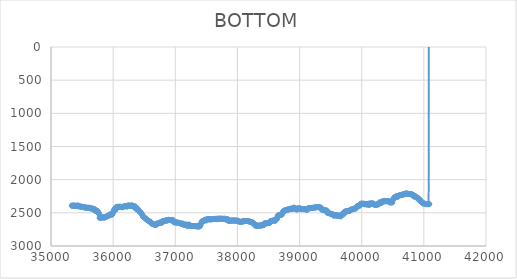
| Category | BOTTOM |
|---|---|
| 35334.9309 | 2391.88 |
| 35342.0646 | 2391.86 |
| 35352.3041 | 2391.86 |
| 35362.5442 | 2391.86 |
| 35372.7842 | 2391.86 |
| 35383.0243 | 2393.23 |
| 35393.2643 | 2393.26 |
| 35403.5044 | 2393.26 |
| 35413.7444 | 2393.26 |
| 35423.9845 | 2398.76 |
| 35434.2245 | 2387.91 |
| 35444.4646 | 2401.37 |
| 35454.7046 | 2403.08 |
| 35464.9447 | 2404.49 |
| 35475.1847 | 2405.9 |
| 35485.4248 | 2407.31 |
| 35495.6648 | 2408.72 |
| 35505.9049 | 2411.5 |
| 35516.1449 | 2414.31 |
| 35526.385 | 2414.38 |
| 35536.625 | 2415.75 |
| 35546.8651 | 2418.54 |
| 35557.1051 | 2421.35 |
| 35567.3452 | 2422.79 |
| 35577.5852 | 2424.2 |
| 35587.8253 | 2422.85 |
| 35598.0653 | 2424.2 |
| 35608.3054 | 2424.23 |
| 35618.5454 | 2425.61 |
| 35628.7855 | 2429.78 |
| 35639.0255 | 2435.38 |
| 35649.2656 | 2432.73 |
| 35659.5056 | 2432.68 |
| 35669.7457 | 2436.82 |
| 35679.9857 | 2445.18 |
| 35690.2258 | 2449.49 |
| 35700.4658 | 2442.66 |
| 35710.7059 | 2470.15 |
| 35720.9459 | 2461.01 |
| 35731.186 | 2469.12 |
| 35741.426 | 2467.89 |
| 35751.6661 | 2481.69 |
| 35761.9061 | 2504.06 |
| 35772.1462 | 2504.47 |
| 35782.3862 | 2573.62 |
| 35792.6263 | 2576.23 |
| 35802.8663 | 2569.34 |
| 35813.1064 | 2569.22 |
| 35823.3464 | 2569.22 |
| 35833.5865 | 2569.22 |
| 35843.8265 | 2569.22 |
| 35854.0666 | 2569.22 |
| 35864.3066 | 2569.22 |
| 35874.5467 | 2564.5 |
| 35884.7867 | 2559.72 |
| 35895.0268 | 2554.93 |
| 35905.2668 | 2550.14 |
| 35915.5069 | 2545.36 |
| 35925.7469 | 2545.29 |
| 35935.987 | 2530.03 |
| 35946.227 | 2525.64 |
| 35956.4671 | 2526.97 |
| 35966.7071 | 2526.99 |
| 35976.9472 | 2528.38 |
| 35987.1872 | 2520.06 |
| 35997.4273 | 2497.72 |
| 36007.6673 | 2472.42 |
| 36017.9074 | 2452.64 |
| 36028.1474 | 2437.09 |
| 36038.3875 | 2454.97 |
| 36048.6275 | 2414.87 |
| 36058.8676 | 2411.6 |
| 36069.1076 | 2408.78 |
| 36079.3477 | 2410.14 |
| 36089.5877 | 2408.76 |
| 36099.8278 | 2410.14 |
| 36110.0678 | 2408.76 |
| 36120.3079 | 2408.75 |
| 36130.5479 | 2410.14 |
| 36140.788 | 2415.73 |
| 36151.028 | 2414.39 |
| 36161.2681 | 2411.59 |
| 36171.5081 | 2403.2 |
| 36181.7482 | 2398.93 |
| 36191.9882 | 2397.5 |
| 36202.2283 | 2398.88 |
| 36212.4683 | 2396.1 |
| 36222.7084 | 2407.24 |
| 36232.9484 | 2391.99 |
| 36243.1885 | 2393.25 |
| 36253.4285 | 2387.68 |
| 36263.6686 | 2393.22 |
| 36273.9086 | 2394.66 |
| 36284.1487 | 2394.67 |
| 36294.3887 | 2389.08 |
| 36304.6288 | 2389.04 |
| 36314.8688 | 2393.24 |
| 36325.1089 | 2405.85 |
| 36335.3489 | 2405.93 |
| 36345.589 | 2401.74 |
| 36355.829 | 2405.91 |
| 36366.0691 | 2438.12 |
| 36376.3091 | 2439.71 |
| 36386.5492 | 2432.72 |
| 36396.7892 | 2448.08 |
| 36407.0293 | 2463.57 |
| 36417.2693 | 2472.75 |
| 36427.5094 | 2481.9 |
| 36437.7494 | 2491.05 |
| 36447.9895 | 2500.2 |
| 36458.2295 | 2514.96 |
| 36468.4696 | 2529.75 |
| 36478.7096 | 2553.65 |
| 36488.9497 | 2561.21 |
| 36499.1897 | 2568.72 |
| 36509.4298 | 2576.23 |
| 36519.6698 | 2584.33 |
| 36529.9099 | 2592.42 |
| 36540.1499 | 2600.52 |
| 36550.39 | 2608.61 |
| 36560.63 | 2614.81 |
| 36570.8701 | 2621.01 |
| 36581.1101 | 2627.2 |
| 36591.3502 | 2633.4 |
| 36601.5902 | 2639.59 |
| 36611.8303 | 2651.55 |
| 36622.0703 | 2663.52 |
| 36632.3104 | 2667.04 |
| 36642.5504 | 2670.56 |
| 36652.7905 | 2674.08 |
| 36663.0305 | 2677.6 |
| 36673.2706 | 2680.42 |
| 36683.5106 | 2676.2 |
| 36693.7507 | 2679 |
| 36703.9907 | 2664.93 |
| 36714.2308 | 2657.9 |
| 36724.4708 | 2660.7 |
| 36734.7109 | 2655.08 |
| 36744.9509 | 2653.66 |
| 36755.191 | 2646.63 |
| 36765.431 | 2642.42 |
| 36775.6711 | 2648.04 |
| 36785.9111 | 2647.98 |
| 36796.1512 | 2622.72 |
| 36806.3912 | 2629.72 |
| 36816.6313 | 2622.7 |
| 36826.8713 | 2621.29 |
| 36837.1114 | 2619.87 |
| 36847.3514 | 2612.86 |
| 36857.5915 | 2615.66 |
| 36867.8315 | 2614.25 |
| 36878.0716 | 2612.82 |
| 36888.3116 | 2605.81 |
| 36898.5517 | 2604.43 |
| 36908.7917 | 2608.63 |
| 36919.0318 | 2608.65 |
| 36929.2718 | 2612.84 |
| 36939.5119 | 2611.45 |
| 36949.7519 | 2612.81 |
| 36959.992 | 2605.92 |
| 36970.232 | 2622.83 |
| 36980.4721 | 2642.41 |
| 36990.7121 | 2642.41 |
| 37000.9522 | 2642.43 |
| 37011.1922 | 2645.23 |
| 37021.4323 | 2645.24 |
| 37031.6723 | 2646.66 |
| 37041.9124 | 2649.46 |
| 37052.1524 | 2650.87 |
| 37062.3925 | 2652.28 |
| 37072.6325 | 2653.68 |
| 37082.8726 | 2655.19 |
| 37093.1126 | 2667.76 |
| 37103.3527 | 2669.09 |
| 37113.5927 | 2662.13 |
| 37123.8328 | 2663.68 |
| 37134.0728 | 2680.42 |
| 37144.3129 | 2680.42 |
| 37154.5529 | 2680.4 |
| 37164.793 | 2679 |
| 37175.033 | 2677.6 |
| 37185.2731 | 2677.85 |
| 37195.5131 | 2701.41 |
| 37205.7532 | 2690.13 |
| 37215.9932 | 2677.65 |
| 37226.2333 | 2681.94 |
| 37236.4733 | 2691.73 |
| 37246.7134 | 2695.92 |
| 37256.9534 | 2697.31 |
| 37267.1935 | 2697.33 |
| 37277.4335 | 2698.73 |
| 37287.6736 | 2700.12 |
| 37297.9136 | 2700.12 |
| 37308.1537 | 2700.11 |
| 37318.3937 | 2698.75 |
| 37328.6338 | 2701.48 |
| 37338.8739 | 2697.42 |
| 37349.1139 | 2705.74 |
| 37359.354 | 2704.35 |
| 37369.594 | 2704.37 |
| 37379.8341 | 2705.75 |
| 37390.0741 | 2705.61 |
| 37400.3142 | 2695.53 |
| 37410.5542 | 2670.21 |
| 37420.7943 | 2646.34 |
| 37431.0343 | 2626.91 |
| 37441.2744 | 2625.45 |
| 37451.5144 | 2621.34 |
| 37461.7545 | 2623.82 |
| 37471.9945 | 2605.79 |
| 37482.2346 | 2604.36 |
| 37492.4746 | 2601.8 |
| 37502.7147 | 2613.98 |
| 37512.9547 | 2597.34 |
| 37523.1948 | 2595.94 |
| 37533.4348 | 2594.53 |
| 37543.6749 | 2593.25 |
| 37553.9149 | 2598.8 |
| 37564.155 | 2600.16 |
| 37574.395 | 2598.72 |
| 37584.6351 | 2595.93 |
| 37594.8751 | 2594.55 |
| 37605.1152 | 2594.55 |
| 37615.3552 | 2594.5 |
| 37625.5953 | 2591.74 |
| 37635.8353 | 2591.74 |
| 37646.0754 | 2591.71 |
| 37656.3154 | 2590.33 |
| 37666.5555 | 2590.47 |
| 37676.7955 | 2597.2 |
| 37687.0356 | 2588.92 |
| 37697.2756 | 2588.92 |
| 37707.5157 | 2588.92 |
| 37717.7557 | 2588.92 |
| 37727.9958 | 2588.92 |
| 37738.2358 | 2588.95 |
| 37748.4759 | 2590.33 |
| 37758.7159 | 2590.36 |
| 37768.956 | 2591.64 |
| 37779.196 | 2587.64 |
| 37789.4361 | 2593.05 |
| 37799.6761 | 2588.99 |
| 37809.9162 | 2592.09 |
| 37820.1562 | 2606.9 |
| 37830.3963 | 2593.31 |
| 37840.6363 | 2600.18 |
| 37850.8764 | 2600.72 |
| 37861.1164 | 2622.64 |
| 37871.3565 | 2619.86 |
| 37881.5965 | 2618.48 |
| 37891.8366 | 2618.45 |
| 37902.0766 | 2617.08 |
| 37912.3167 | 2617.04 |
| 37922.5567 | 2615.67 |
| 37932.7968 | 2615.67 |
| 37943.0368 | 2615.7 |
| 37953.2769 | 2617.08 |
| 37963.5169 | 2617.11 |
| 37973.757 | 2618.52 |
| 37983.997 | 2619.78 |
| 37994.2371 | 2615.79 |
| 38004.4771 | 2620.29 |
| 38014.7172 | 2624.8 |
| 38024.9572 | 2629.3 |
| 38035.1973 | 2633.81 |
| 38045.4373 | 2638.13 |
| 38055.6774 | 2635.87 |
| 38065.9174 | 2633.62 |
| 38076.1575 | 2631.37 |
| 38086.3975 | 2629.12 |
| 38096.6376 | 2626.9 |
| 38106.8776 | 2625.96 |
| 38117.1177 | 2625.02 |
| 38127.3577 | 2624.11 |
| 38137.5978 | 2624.11 |
| 38147.8378 | 2624.11 |
| 38158.0779 | 2624.11 |
| 38168.3179 | 2624.2 |
| 38178.558 | 2627.01 |
| 38188.798 | 2629.83 |
| 38199.0381 | 2632.65 |
| 38209.2781 | 2635.46 |
| 38219.5182 | 2638.31 |
| 38229.7582 | 2642.07 |
| 38239.9983 | 2644 |
| 38250.2383 | 2649.94 |
| 38260.4784 | 2665.02 |
| 38270.7184 | 2667.84 |
| 38280.9585 | 2671.38 |
| 38291.1985 | 2695.67 |
| 38301.4386 | 2689.05 |
| 38311.6786 | 2694.63 |
| 38321.9187 | 2698.48 |
| 38332.1587 | 2691.77 |
| 38342.3988 | 2694.4 |
| 38352.6388 | 2691.68 |
| 38362.8789 | 2691.77 |
| 38373.1189 | 2694.25 |
| 38383.359 | 2687.5 |
| 38393.599 | 2688.67 |
| 38403.8391 | 2683.38 |
| 38414.0791 | 2687.31 |
| 38424.3192 | 2682.39 |
| 38434.5592 | 2659.3 |
| 38444.7993 | 2659.25 |
| 38455.0393 | 2657.85 |
| 38465.2794 | 2656.49 |
| 38475.5194 | 2656.44 |
| 38485.7595 | 2655.08 |
| 38495.9995 | 2655.08 |
| 38506.2396 | 2655.03 |
| 38516.4796 | 2652.79 |
| 38526.7197 | 2629.48 |
| 38536.9597 | 2622.86 |
| 38547.1998 | 2626.66 |
| 38557.4398 | 2619.84 |
| 38567.6799 | 2618.43 |
| 38577.9199 | 2617.08 |
| 38588.16 | 2616.97 |
| 38598.4 | 2614.48 |
| 38608.6401 | 2618.85 |
| 38618.8801 | 2593.15 |
| 38629.1202 | 2593.03 |
| 38639.3602 | 2588.5 |
| 38649.6003 | 2543.71 |
| 38659.8403 | 2539.38 |
| 38670.0804 | 2532.73 |
| 38680.3204 | 2535.32 |
| 38690.5605 | 2532.5 |
| 38700.8005 | 2529.75 |
| 38711.0406 | 2527.88 |
| 38721.2806 | 2514.57 |
| 38731.5207 | 2486.93 |
| 38741.7607 | 2472.09 |
| 38752.0008 | 2471.74 |
| 38762.2408 | 2463.53 |
| 38772.4809 | 2460.83 |
| 38782.7209 | 2460.71 |
| 38792.961 | 2458.01 |
| 38803.201 | 2457.47 |
| 38813.4411 | 2445.53 |
| 38823.6811 | 2449.26 |
| 38833.9212 | 2442.59 |
| 38844.1612 | 2443.75 |
| 38854.4013 | 2439.65 |
| 38864.6413 | 2438.12 |
| 38874.8814 | 2434.33 |
| 38885.1214 | 2439.72 |
| 38895.3615 | 2439.02 |
| 38905.6015 | 2424.11 |
| 38915.8416 | 2422.05 |
| 38926.0816 | 2435.62 |
| 38936.3217 | 2438.31 |
| 38946.5617 | 2439.01 |
| 38956.8018 | 2452.89 |
| 38967.0418 | 2434.08 |
| 38977.2819 | 2434.08 |
| 38987.5219 | 2434.08 |
| 38997.762 | 2434.08 |
| 39008.002 | 2434.15 |
| 39018.2421 | 2435.96 |
| 39028.4821 | 2445.28 |
| 39038.7222 | 2443.94 |
| 39048.9622 | 2443.94 |
| 39059.2023 | 2443.94 |
| 39069.4423 | 2443.94 |
| 39079.6824 | 2443.94 |
| 39089.9224 | 2444.28 |
| 39100.1625 | 2450.84 |
| 39110.4025 | 2448.51 |
| 39120.6426 | 2454.85 |
| 39130.8827 | 2447.33 |
| 39141.1227 | 2431.13 |
| 39151.3628 | 2428.45 |
| 39161.6028 | 2428.45 |
| 39171.8429 | 2428.38 |
| 39182.0829 | 2427.12 |
| 39192.323 | 2428.38 |
| 39202.563 | 2426.83 |
| 39212.8031 | 2422.97 |
| 39223.0431 | 2425.42 |
| 39233.2832 | 2421.34 |
| 39243.5232 | 2420.01 |
| 39253.7633 | 2419.72 |
| 39264.0033 | 2414.38 |
| 39274.2434 | 2414.38 |
| 39284.4834 | 2414.45 |
| 39294.7235 | 2415.56 |
| 39304.9635 | 2411.71 |
| 39315.2036 | 2414.38 |
| 39325.4436 | 2414.75 |
| 39335.6837 | 2421.57 |
| 39345.9237 | 2425.74 |
| 39356.1638 | 2452.38 |
| 39366.4038 | 2452.46 |
| 39376.6439 | 2453.87 |
| 39386.8839 | 2455.2 |
| 39397.124 | 2455.66 |
| 39407.364 | 2463.72 |
| 39417.6041 | 2464.98 |
| 39427.8441 | 2463.72 |
| 39438.0842 | 2467 |
| 39448.3242 | 2500.24 |
| 39458.5643 | 2500.32 |
| 39468.8043 | 2501.97 |
| 39479.0444 | 2507.28 |
| 39489.2844 | 2507.84 |
| 39499.5245 | 2517.29 |
| 39509.7645 | 2520.03 |
| 39520.0046 | 2521.36 |
| 39530.2446 | 2521.52 |
| 39540.4847 | 2525.22 |
| 39550.7247 | 2542.39 |
| 39560.9648 | 2540.57 |
| 39571.2048 | 2533.03 |
| 39581.4449 | 2539.66 |
| 39591.6849 | 2539.49 |
| 39601.925 | 2537.09 |
| 39612.165 | 2541.06 |
| 39622.4051 | 2541.4 |
| 39632.6451 | 2546.69 |
| 39642.8852 | 2546.95 |
| 39653.1252 | 2551.17 |
| 39663.3653 | 2553.45 |
| 39673.6053 | 2526.73 |
| 39683.8454 | 2522.76 |
| 39694.0854 | 2522.94 |
| 39704.3255 | 2524.38 |
| 39714.5655 | 2504.5 |
| 39724.8056 | 2483.35 |
| 39735.0456 | 2483.01 |
| 39745.2857 | 2477.72 |
| 39755.5257 | 2477.63 |
| 39765.7658 | 2476.23 |
| 39776.0058 | 2474.64 |
| 39786.2459 | 2470.68 |
| 39796.4859 | 2470.68 |
| 39806.726 | 2469.71 |
| 39816.966 | 2455.11 |
| 39827.2061 | 2453.44 |
| 39837.4461 | 2448.07 |
| 39847.6862 | 2446.57 |
| 39857.9262 | 2443.85 |
| 39868.1663 | 2442.17 |
| 39878.4063 | 2436.99 |
| 39888.6464 | 2438.31 |
| 39898.8864 | 2437.03 |
| 39909.1265 | 2418.6 |
| 39919.3665 | 2417.14 |
| 39929.6066 | 2396.08 |
| 39939.8466 | 2395.99 |
| 39950.0867 | 2394.49 |
| 39960.3267 | 2391.86 |
| 39970.5668 | 2390.28 |
| 39980.8068 | 2367.46 |
| 39991.0469 | 2360.98 |
| 40001.2869 | 2362.39 |
| 40011.527 | 2363.61 |
| 40021.767 | 2362.3 |
| 40032.0071 | 2362.86 |
| 40042.2471 | 2370.55 |
| 40052.4872 | 2367.93 |
| 40062.7272 | 2368.21 |
| 40072.9673 | 2372.15 |
| 40083.2073 | 2372.15 |
| 40093.4474 | 2372.44 |
| 40103.6874 | 2375.21 |
| 40113.9275 | 2361.13 |
| 40124.1675 | 2381.85 |
| 40134.4076 | 2360.79 |
| 40144.6476 | 2359.48 |
| 40154.8877 | 2359.38 |
| 40165.1277 | 2358.07 |
| 40175.3678 | 2358.27 |
| 40185.6078 | 2361.38 |
| 40195.8479 | 2368.72 |
| 40206.0879 | 2379.19 |
| 40216.328 | 2379.09 |
| 40226.568 | 2378.18 |
| 40236.8081 | 2382.81 |
| 40247.0481 | 2374.26 |
| 40257.2882 | 2365.72 |
| 40267.5282 | 2372.95 |
| 40277.7683 | 2363.39 |
| 40288.0083 | 2341.39 |
| 40298.2484 | 2344.51 |
| 40308.4884 | 2350.93 |
| 40318.7285 | 2348.09 |
| 40328.9685 | 2328.51 |
| 40339.2086 | 2328.51 |
| 40349.4486 | 2328.41 |
| 40359.6887 | 2326.48 |
| 40369.9288 | 2319.18 |
| 40380.1688 | 2325.59 |
| 40390.4089 | 2324.29 |
| 40400.6489 | 2324.29 |
| 40410.889 | 2324.4 |
| 40421.129 | 2325.7 |
| 40431.3691 | 2325.8 |
| 40441.6091 | 2328.17 |
| 40451.8492 | 2341.29 |
| 40462.0892 | 2342.59 |
| 40472.3293 | 2342.7 |
| 40482.5693 | 2344 |
| 40492.8094 | 2340.77 |
| 40503.0494 | 2300.69 |
| 40513.2895 | 2285.96 |
| 40523.5295 | 2265.71 |
| 40533.7696 | 2271.01 |
| 40544.0096 | 2256.73 |
| 40554.2497 | 2255.96 |
| 40564.4897 | 2248.19 |
| 40574.7298 | 2262.22 |
| 40584.9698 | 2244.06 |
| 40595.2099 | 2243.5 |
| 40605.4499 | 2236.91 |
| 40615.69 | 2235.5 |
| 40625.93 | 2234.09 |
| 40636.1701 | 2232.57 |
| 40646.4101 | 2229.87 |
| 40656.6502 | 2227.9 |
| 40666.8902 | 2220.13 |
| 40677.1303 | 2220.01 |
| 40687.3703 | 2218.61 |
| 40697.6104 | 2216.52 |
| 40707.8504 | 2207.58 |
| 40718.0905 | 2209.13 |
| 40728.3305 | 2210.68 |
| 40738.5706 | 2212.23 |
| 40748.8106 | 2213.78 |
| 40759.0507 | 2215.33 |
| 40769.2907 | 2216.88 |
| 40779.5308 | 2218.42 |
| 40789.7708 | 2219.97 |
| 40800.0109 | 2221.52 |
| 40810.2509 | 2223.29 |
| 40820.491 | 2227.52 |
| 40830.731 | 2233.38 |
| 40840.9711 | 2254.97 |
| 40851.2111 | 2251.09 |
| 40861.4512 | 2251.45 |
| 40871.6912 | 2256.38 |
| 40881.9313 | 2268.34 |
| 40892.1713 | 2272.57 |
| 40902.4114 | 2276.79 |
| 40912.6514 | 2282.68 |
| 40922.8915 | 2304.94 |
| 40933.1315 | 2308.57 |
| 40943.3716 | 2308.4 |
| 40953.6116 | 2334.51 |
| 40963.8517 | 2338.73 |
| 40974.0917 | 2343.68 |
| 40984.3318 | 2355.62 |
| 40994.5718 | 2359.36 |
| 41004.8119 | 2358.44 |
| 41015.0519 | 2362.91 |
| 41025.292 | 2369.21 |
| 41035.532 | 2368.05 |
| 41045.7721 | 2369.33 |
| 41056.0121 | 2369.33 |
| 41066.2522 | 2369.33 |
| 41076.4922 | 2369.21 |
| 41086.7323 | 2367.55 |
| 41096.7512 | -9999 |